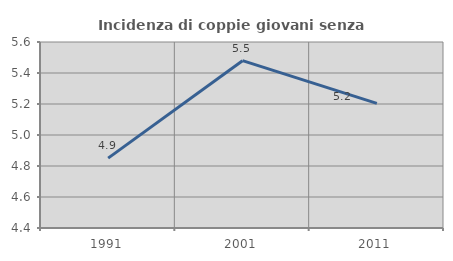
| Category | Incidenza di coppie giovani senza figli |
|---|---|
| 1991.0 | 4.851 |
| 2001.0 | 5.479 |
| 2011.0 | 5.204 |